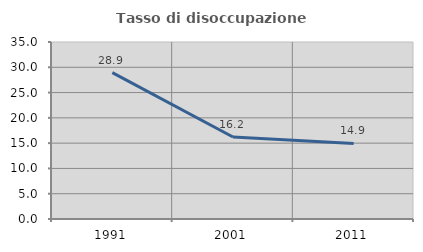
| Category | Tasso di disoccupazione giovanile  |
|---|---|
| 1991.0 | 28.947 |
| 2001.0 | 16.216 |
| 2011.0 | 14.943 |